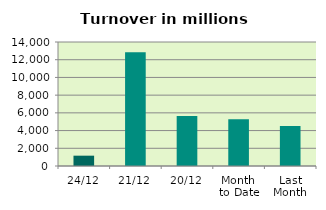
| Category | Series 0 |
|---|---|
| 24/12 | 1165.724 |
| 21/12 | 12852.802 |
| 20/12 | 5653.436 |
| Month 
to Date | 5283.614 |
| Last
Month | 4514.728 |